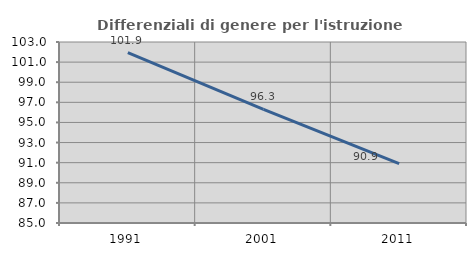
| Category | Differenziali di genere per l'istruzione superiore |
|---|---|
| 1991.0 | 101.948 |
| 2001.0 | 96.298 |
| 2011.0 | 90.907 |